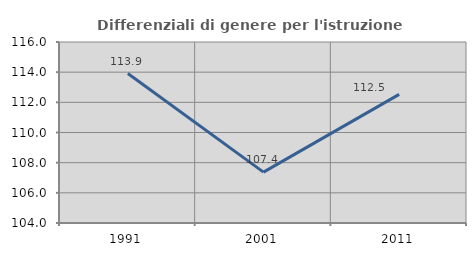
| Category | Differenziali di genere per l'istruzione superiore |
|---|---|
| 1991.0 | 113.91 |
| 2001.0 | 107.375 |
| 2011.0 | 112.525 |